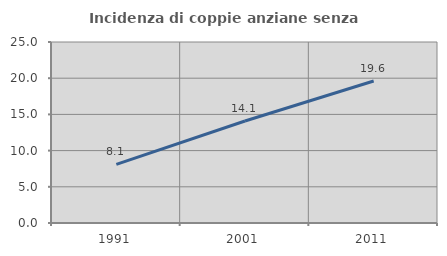
| Category | Incidenza di coppie anziane senza figli  |
|---|---|
| 1991.0 | 8.108 |
| 2001.0 | 14.085 |
| 2011.0 | 19.608 |